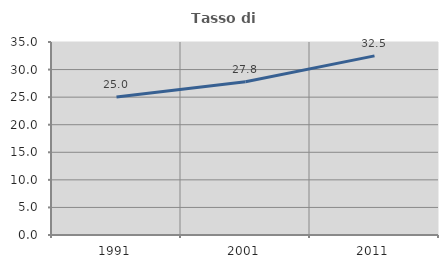
| Category | Tasso di occupazione   |
|---|---|
| 1991.0 | 25.019 |
| 2001.0 | 27.808 |
| 2011.0 | 32.487 |